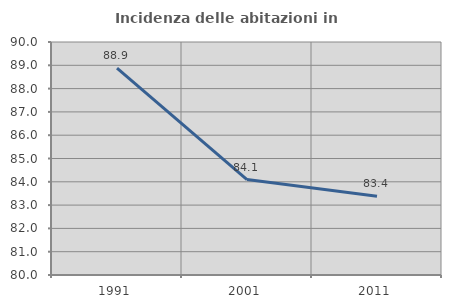
| Category | Incidenza delle abitazioni in proprietà  |
|---|---|
| 1991.0 | 88.875 |
| 2001.0 | 84.097 |
| 2011.0 | 83.378 |